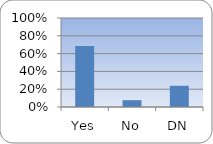
| Category | Series 0 |
|---|---|
| Yes | 0.685 |
| No | 0.077 |
| DN | 0.239 |